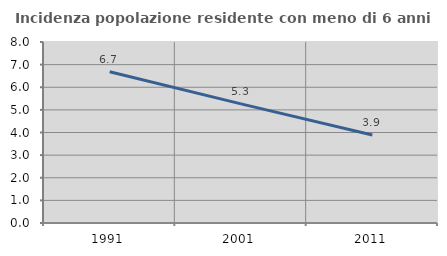
| Category | Incidenza popolazione residente con meno di 6 anni |
|---|---|
| 1991.0 | 6.682 |
| 2001.0 | 5.266 |
| 2011.0 | 3.887 |